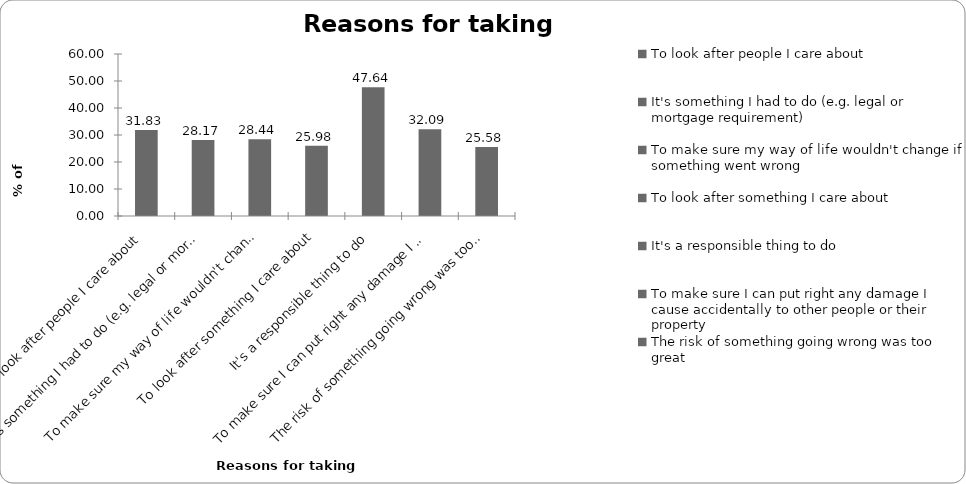
| Category | Reasons for taking insurance |
|---|---|
| To look after people I care about | 31.827 |
| It's something I had to do (e.g. legal or mortgage requirement) | 28.173 |
| To make sure my way of life wouldn't change if something went wrong | 28.439 |
| To look after something I care about | 25.98 |
| It's a responsible thing to do | 47.641 |
| To make sure I can put right any damage I cause accidentally to other people or their property | 32.093 |
| The risk of something going wrong was too great | 25.581 |